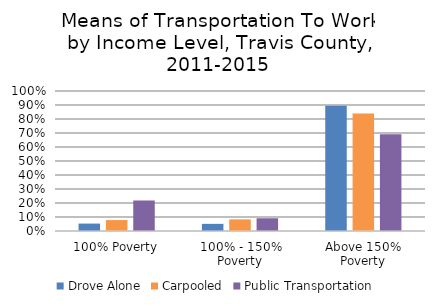
| Category | Drove Alone | Carpooled | Public Transportation |
|---|---|---|---|
| 100% Poverty | 0.053 | 0.078 | 0.218 |
| 100% - 150% Poverty | 0.051 | 0.083 | 0.091 |
| Above 150% Poverty | 0.895 | 0.839 | 0.691 |